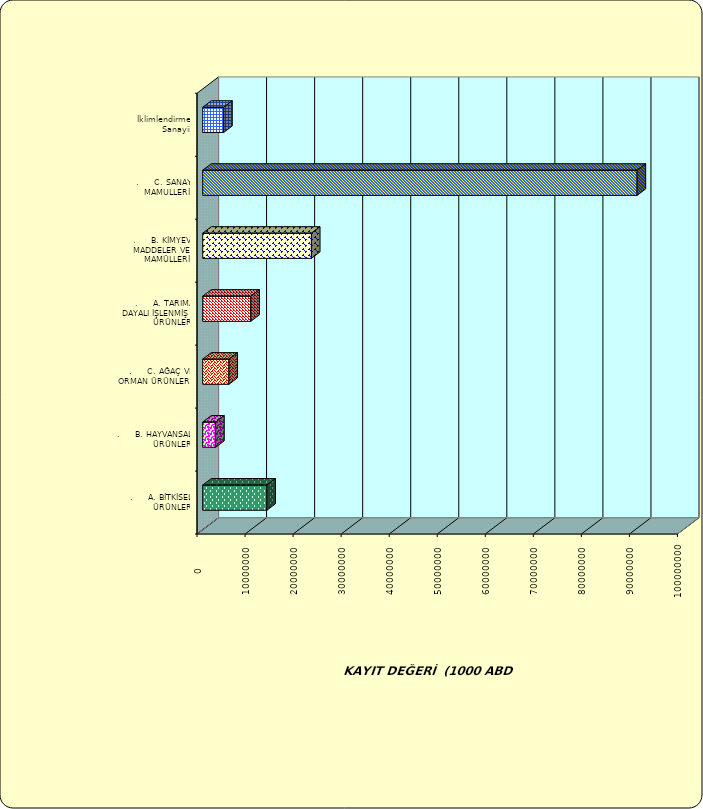
| Category | Series 0 |
|---|---|
| .     A. BİTKİSEL ÜRÜNLER | 13360999.059 |
| .     B. HAYVANSAL ÜRÜNLER | 2695502.328 |
| .     C. AĞAÇ VE ORMAN ÜRÜNLERİ | 5460121.324 |
| .     A. TARIMA DAYALI İŞLENMİŞ ÜRÜNLER | 10013734.205 |
| .     B. KİMYEVİ MADDELER VE MAMÜLLERİ | 22630092.233 |
| .     C. SANAYİ MAMULLERİ | 90410402.601 |
|  İklimlendirme Sanayii | 4367700.116 |